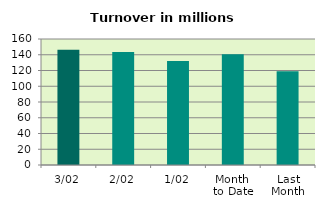
| Category | Series 0 |
|---|---|
| 3/02 | 146.323 |
| 2/02 | 143.641 |
| 1/02 | 132.147 |
| Month 
to Date | 140.704 |
| Last
Month | 119.055 |